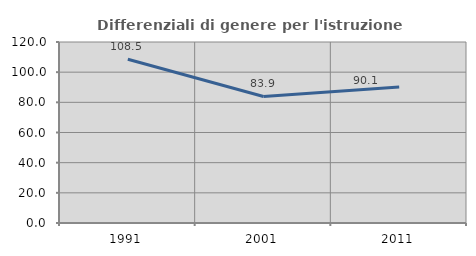
| Category | Differenziali di genere per l'istruzione superiore |
|---|---|
| 1991.0 | 108.533 |
| 2001.0 | 83.914 |
| 2011.0 | 90.127 |